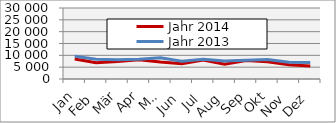
| Category | Jahr 2014 | Jahr 2013 |
|---|---|---|
| 0 | 8485.684 | 9570.389 |
| 1 | 6902.319 | 8384.461 |
| 2 | 7364.743 | 8182.918 |
| 3 | 8167.747 | 8360.492 |
| 4 | 7230.315 | 9012.467 |
| 5 | 6496.041 | 7532.913 |
| 6 | 8060.343 | 8340.545 |
| 7 | 6284.971 | 7568.381 |
| 8 | 7791.664 | 7941.565 |
| 9 | 7285.339 | 8248.009 |
| 10 | 6023.235 | 7124.419 |
| 11 | 5455.345 | 6929.246 |